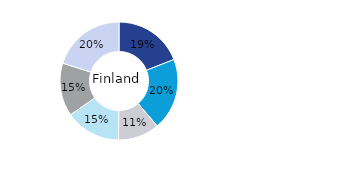
| Category | Finland |
|---|---|
| Office | 0.191 |
| Residential | 0.197 |
| Retail | 0.113 |
| Logistics* | 0.152 |
| Public Sector | 0.146 |
| Other | 0.201 |